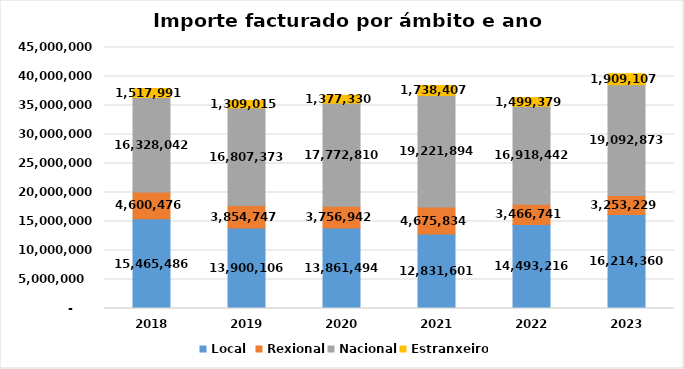
| Category | Local  | Rexional | Nacional | Estranxeiro |
|---|---|---|---|---|
| 2018.0 | 15465485.87 | 4600476.29 | 16328042.16 | 1517991.1 |
| 2019.0 | 13900106.15 | 3854747.07 | 16807373.42 | 1309014.91 |
| 2020.0 | 13861493.53 | 3756941.61 | 17772810.06 | 1377330.22 |
| 2021.0 | 12831600.75 | 4675834.23 | 19221893.94 | 1738407.25 |
| 2022.0 | 14493215.78 | 3466741.17 | 16918442.41 | 1499379.3 |
| 2023.0 | 16214360.3 | 3253228.95 | 19092872.69 | 1909107.23 |